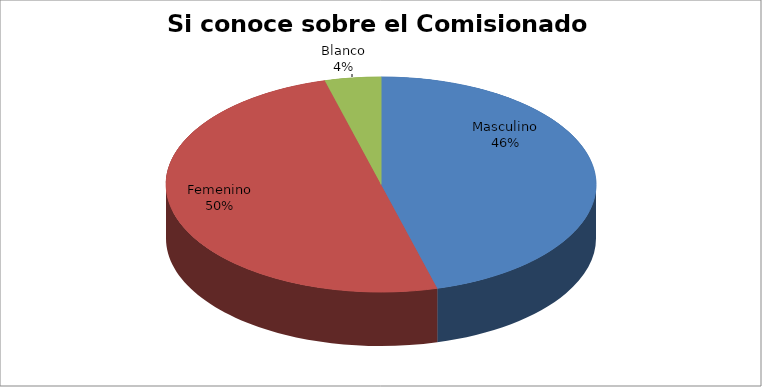
| Category | Series 0 |
|---|---|
| Masculino | 0.458 |
| Femenino | 0.5 |
| Blanco | 0.042 |